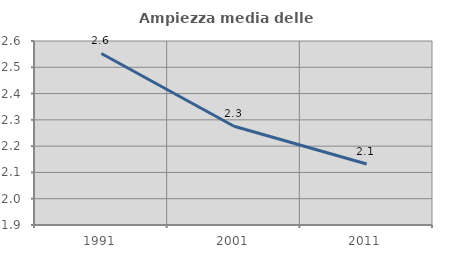
| Category | Ampiezza media delle famiglie |
|---|---|
| 1991.0 | 2.552 |
| 2001.0 | 2.276 |
| 2011.0 | 2.132 |